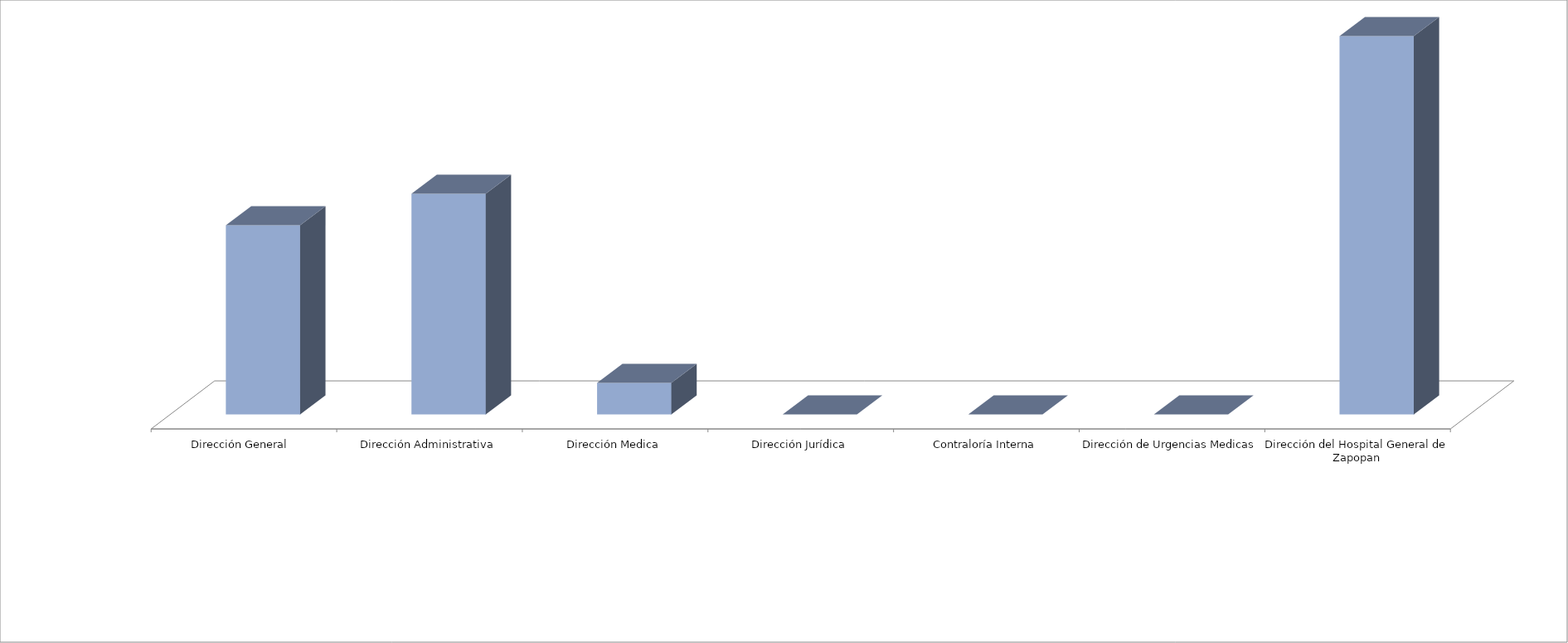
| Category | Series 0 | Series 1 |
|---|---|---|
| Dirección General  |  | 6 |
| Dirección Administrativa |  | 7 |
| Dirección Medica |  | 1 |
| Dirección Jurídica |  | 0 |
| Contraloría Interna |  | 0 |
| Dirección de Urgencias Medicas |  | 0 |
| Dirección del Hospital General de Zapopan |  | 12 |